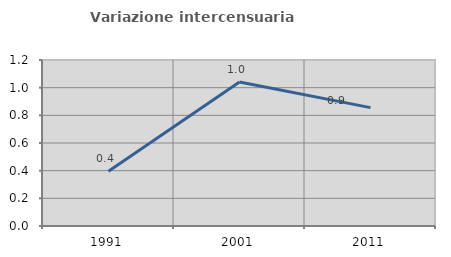
| Category | Variazione intercensuaria annua |
|---|---|
| 1991.0 | 0.395 |
| 2001.0 | 1.042 |
| 2011.0 | 0.856 |